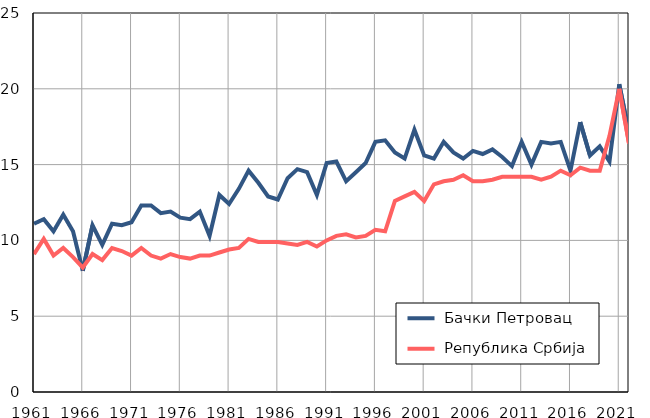
| Category |  Бачки Петровац |  Република Србија |
|---|---|---|
| 1961.0 | 11.1 | 9.1 |
| 1962.0 | 11.4 | 10.1 |
| 1963.0 | 10.6 | 9 |
| 1964.0 | 11.7 | 9.5 |
| 1965.0 | 10.6 | 8.9 |
| 1966.0 | 8 | 8.2 |
| 1967.0 | 11 | 9.1 |
| 1968.0 | 9.7 | 8.7 |
| 1969.0 | 11.1 | 9.5 |
| 1970.0 | 11 | 9.3 |
| 1971.0 | 11.2 | 9 |
| 1972.0 | 12.3 | 9.5 |
| 1973.0 | 12.3 | 9 |
| 1974.0 | 11.8 | 8.8 |
| 1975.0 | 11.9 | 9.1 |
| 1976.0 | 11.5 | 8.9 |
| 1977.0 | 11.4 | 8.8 |
| 1978.0 | 11.9 | 9 |
| 1979.0 | 10.3 | 9 |
| 1980.0 | 13 | 9.2 |
| 1981.0 | 12.4 | 9.4 |
| 1982.0 | 13.4 | 9.5 |
| 1983.0 | 14.6 | 10.1 |
| 1984.0 | 13.8 | 9.9 |
| 1985.0 | 12.9 | 9.9 |
| 1986.0 | 12.7 | 9.9 |
| 1987.0 | 14.1 | 9.8 |
| 1988.0 | 14.7 | 9.7 |
| 1989.0 | 14.5 | 9.9 |
| 1990.0 | 13 | 9.6 |
| 1991.0 | 15.1 | 10 |
| 1992.0 | 15.2 | 10.3 |
| 1993.0 | 13.9 | 10.4 |
| 1994.0 | 14.5 | 10.2 |
| 1995.0 | 15.1 | 10.3 |
| 1996.0 | 16.5 | 10.7 |
| 1997.0 | 16.6 | 10.6 |
| 1998.0 | 15.8 | 12.6 |
| 1999.0 | 15.4 | 12.9 |
| 2000.0 | 17.3 | 13.2 |
| 2001.0 | 15.6 | 12.6 |
| 2002.0 | 15.4 | 13.7 |
| 2003.0 | 16.5 | 13.9 |
| 2004.0 | 15.8 | 14 |
| 2005.0 | 15.4 | 14.3 |
| 2006.0 | 15.9 | 13.9 |
| 2007.0 | 15.7 | 13.9 |
| 2008.0 | 16 | 14 |
| 2009.0 | 15.5 | 14.2 |
| 2010.0 | 14.9 | 14.2 |
| 2011.0 | 16.5 | 14.2 |
| 2012.0 | 15 | 14.2 |
| 2013.0 | 16.5 | 14 |
| 2014.0 | 16.4 | 14.2 |
| 2015.0 | 16.5 | 14.6 |
| 2016.0 | 14.6 | 14.3 |
| 2017.0 | 17.8 | 14.8 |
| 2018.0 | 15.6 | 14.6 |
| 2019.0 | 16.2 | 14.6 |
| 2020.0 | 15.2 | 16.9 |
| 2021.0 | 20.3 | 20 |
| 2022.0 | 17.1 | 16.4 |